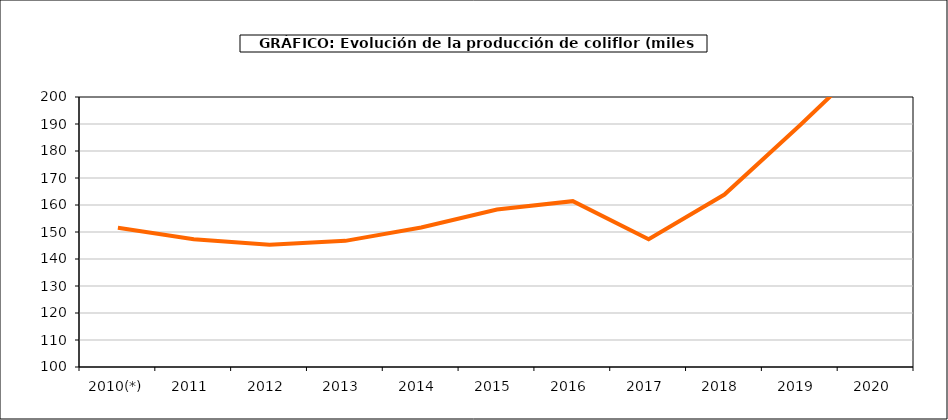
| Category | producción |
|---|---|
| 2010(*) | 151.573 |
| 2011  | 147.3 |
| 2012  | 145.268 |
| 2013  | 146.724 |
| 2014  | 151.651 |
| 2015  | 158.34 |
| 2016  | 161.424 |
| 2017  | 147.33 |
| 2018  | 163.868 |
| 2019  | 189.638 |
| 2020  | 216.389 |